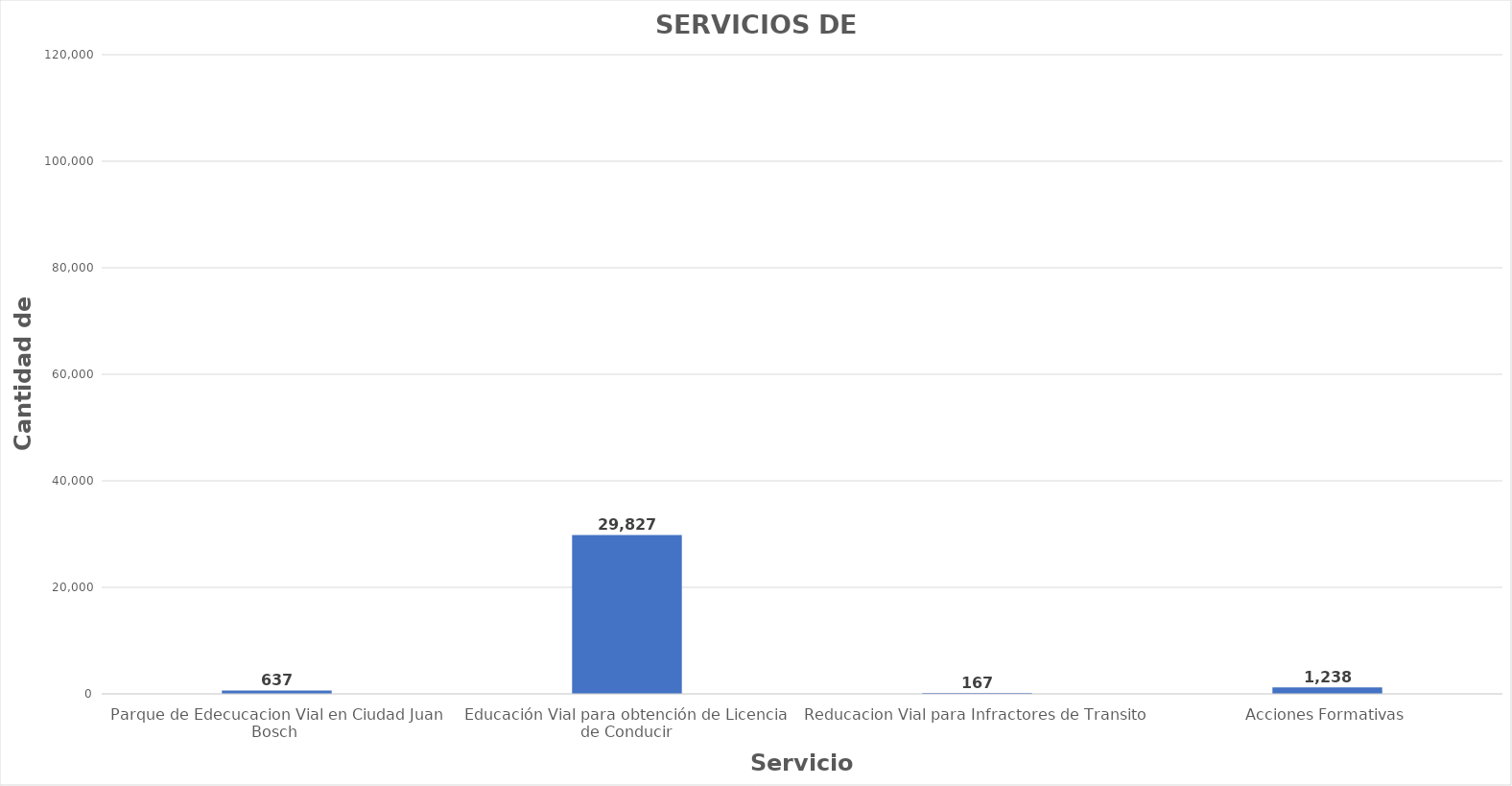
| Category | Series 0 |
|---|---|
| Parque de Edecucacion Vial en Ciudad Juan Bosch  | 637 |
| Educación Vial para obtención de Licencia de Conducir | 29827 |
| Reducacion Vial para Infractores de Transito  | 167 |
| Acciones Formativas | 1238 |